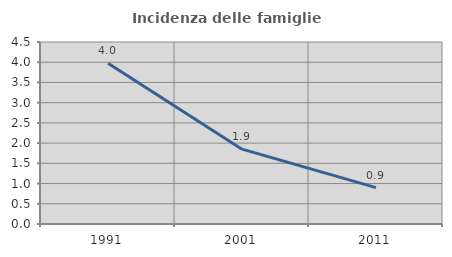
| Category | Incidenza delle famiglie numerose |
|---|---|
| 1991.0 | 3.973 |
| 2001.0 | 1.851 |
| 2011.0 | 0.9 |